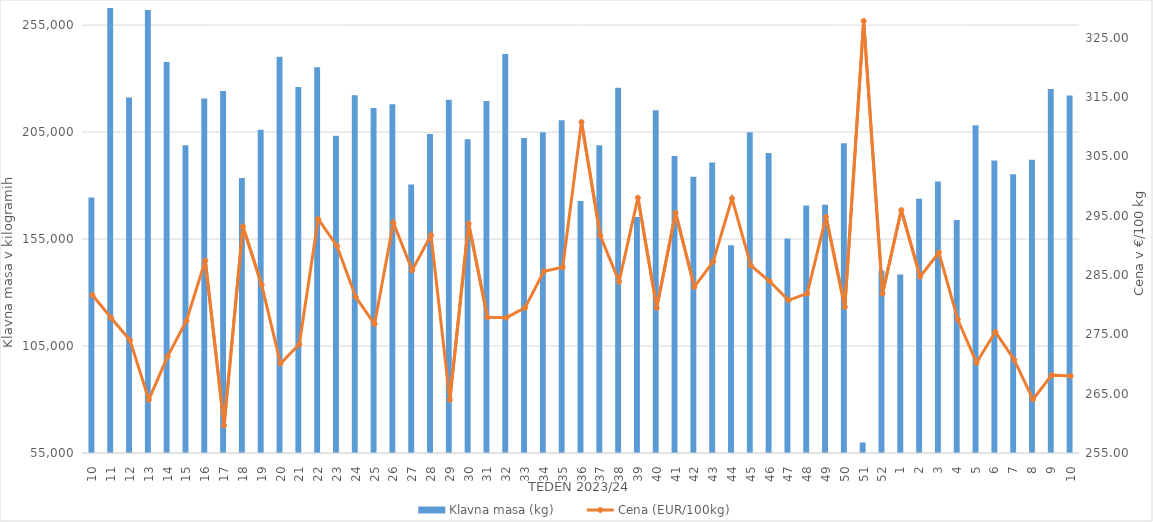
| Category | Klavna masa (kg) |
|---|---|
| 10.0 | 174425 |
| 11.0 | 265476 |
| 12.0 | 221171 |
| 13.0 | 262102 |
| 14.0 | 237813 |
| 15.0 | 198828 |
| 16.0 | 220686 |
| 17.0 | 224192 |
| 18.0 | 183508 |
| 19.0 | 206133 |
| 20.0 | 240223 |
| 21.0 | 226050 |
| 22.0 | 235273 |
| 23.0 | 203306 |
| 24.0 | 222178 |
| 25.0 | 216259 |
| 26.0 | 218064 |
| 27.0 | 180556 |
| 28.0 | 204078 |
| 29.0 | 220162 |
| 30.0 | 201649 |
| 31.0 | 219538 |
| 32.0 | 241549 |
| 33.0 | 202261 |
| 34.0 | 204903 |
| 35.0 | 210575 |
| 36.0 | 172745 |
| 37.0 | 198877 |
| 38.0 | 225730 |
| 39.0 | 165273 |
| 40.0 | 215175 |
| 41.0 | 193769 |
| 42.0 | 184122 |
| 43.0 | 190834 |
| 44.0 | 152119 |
| 45.0 | 204974 |
| 46.0 | 195179 |
| 47.0 | 155300 |
| 48.0 | 170687 |
| 49.0 | 171040 |
| 50.0 | 199802 |
| 51.0 | 59936 |
| 52.0 | 140361 |
| 1.0 | 138450 |
| 2.0 | 173833 |
| 3.0 | 181907 |
| 4.0 | 163901 |
| 5.0 | 208207 |
| 6.0 | 191770 |
| 7.0 | 185347 |
| 8.0 | 192049 |
| 9.0 | 225097 |
| 10.0 | 222116 |